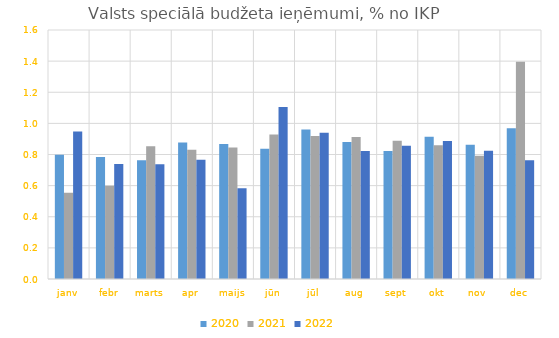
| Category | 2020 | 2021 | 2022 |
|---|---|---|---|
| janv | 0.798 | 0.554 | 0.948 |
| febr | 0.784 | 0.599 | 0.739 |
| marts | 0.763 | 0.853 | 0.737 |
| apr | 0.877 | 0.83 | 0.767 |
| maijs | 0.868 | 0.844 | 0.583 |
| jūn | 0.838 | 0.928 | 1.105 |
| jūl | 0.961 | 0.919 | 0.94 |
| aug | 0.88 | 0.912 | 0.822 |
| sept | 0.822 | 0.889 | 0.857 |
| okt | 0.913 | 0.859 | 0.887 |
| nov | 0.863 | 0.792 | 0.824 |
| dec | 0.969 | 1.396 | 0.763 |